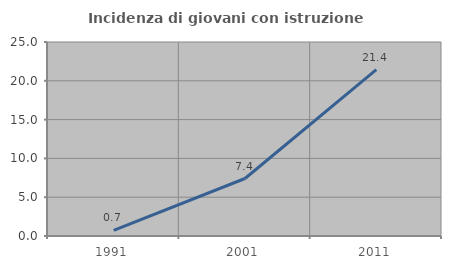
| Category | Incidenza di giovani con istruzione universitaria |
|---|---|
| 1991.0 | 0.714 |
| 2001.0 | 7.407 |
| 2011.0 | 21.429 |